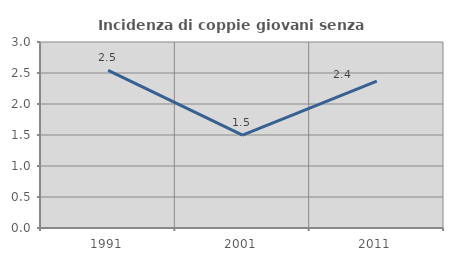
| Category | Incidenza di coppie giovani senza figli |
|---|---|
| 1991.0 | 2.542 |
| 2001.0 | 1.499 |
| 2011.0 | 2.371 |